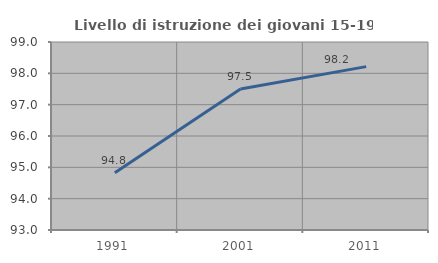
| Category | Livello di istruzione dei giovani 15-19 anni |
|---|---|
| 1991.0 | 94.828 |
| 2001.0 | 97.5 |
| 2011.0 | 98.214 |